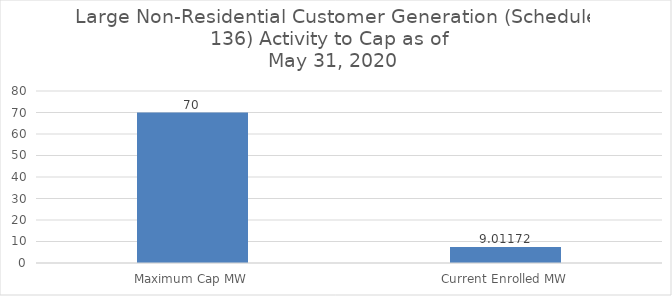
| Category | Series 0 |
|---|---|
| Maximum Cap MW | 70 |
| Current Enrolled MW | 7.467 |